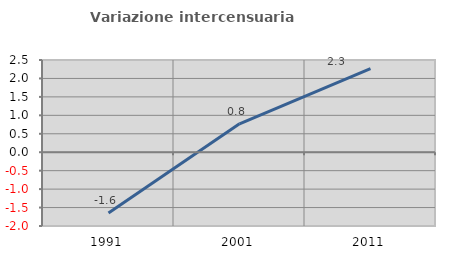
| Category | Variazione intercensuaria annua |
|---|---|
| 1991.0 | -1.649 |
| 2001.0 | 0.771 |
| 2011.0 | 2.267 |